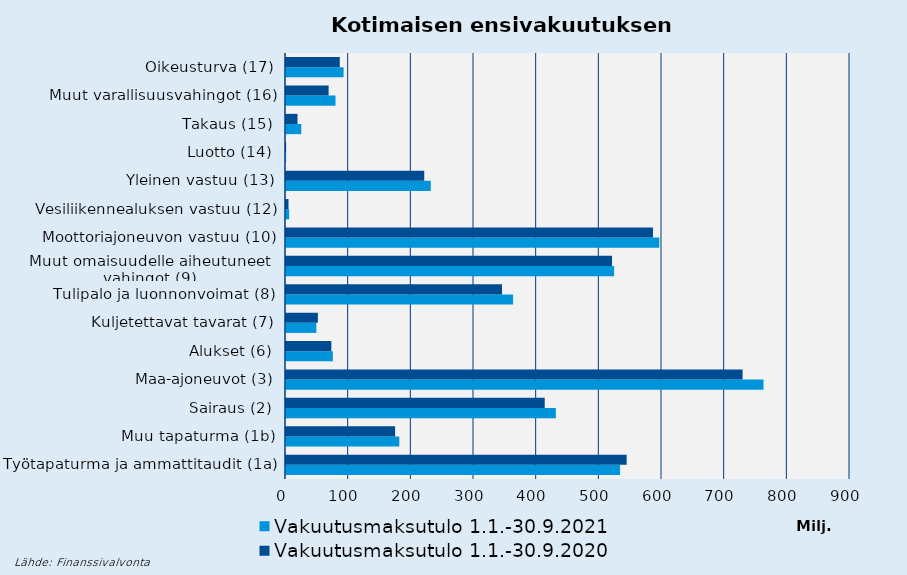
| Category | Vakuutusmaksutulo |
|---|---|
| Työtapaturma ja ammattitaudit (1a) | 543609.656 |
| Muu tapaturma (1b) | 174098.328 |
| Sairaus (2) | 412880.783 |
| Maa-ajoneuvot (3) | 728620.489 |
| Alukset (6) | 72357.856 |
| Kuljetettavat tavarat (7) | 50876.686 |
| Tulipalo ja luonnonvoimat (8) | 344703.554 |
| Muut omaisuudelle aiheutuneet 
vahingot (9) | 520254.862 |
| Moottoriajoneuvon vastuu (10) | 585601.942 |
| Vesiliikennealuksen vastuu (12) | 3972.229 |
| Yleinen vastuu (13) | 220617.779 |
| Luotto (14) | 188.491 |
| Takaus (15) | 18370.615 |
| Muut varallisuusvahingot (16) | 68006.41 |
| Oikeusturva (17) | 85810.009 |